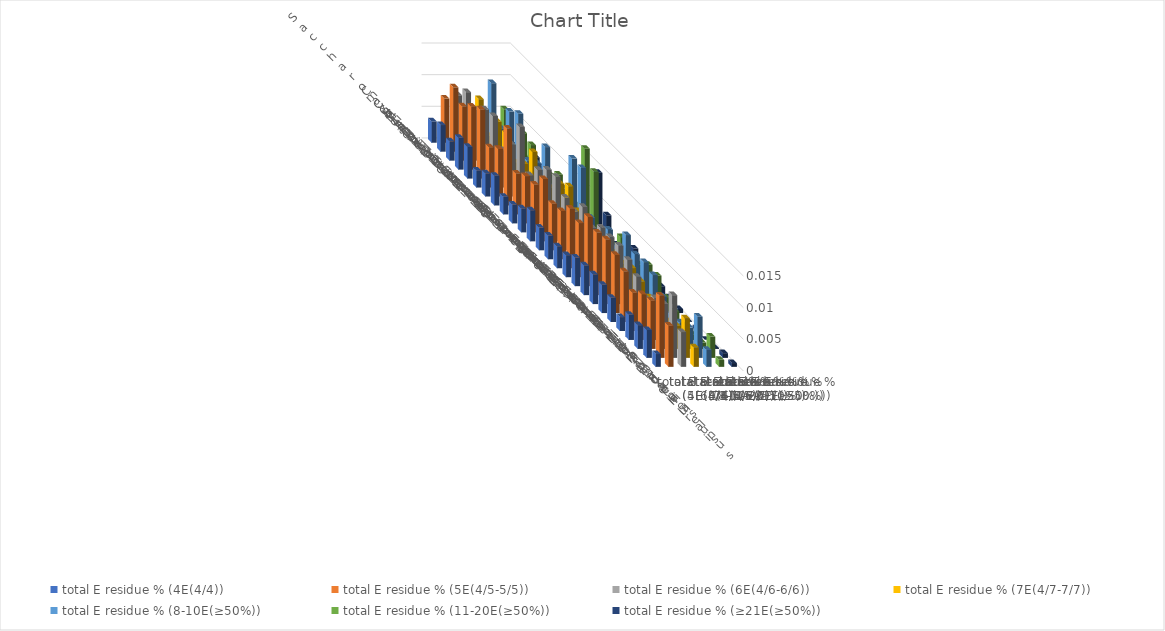
| Category | total E residue % (4E(4/4)) | total E residue % (5E(4/5-5/5)) | total E residue % (6E(4/6-6/6)) | total E residue % (7E(4/7-7/7)) | total E residue % (8-10E(≥50%)) | total E residue % (11-20E(≥50%)) | total E residue % (≥21E(≥50%)) |
|---|---|---|---|---|---|---|---|
| Saccharomyces cerevisiae S288c | 0.003 | 0.007 | 0.008 | 0.005 | 0.005 | 0.003 | 0 |
| Candida albicans | 0.004 | 0.01 | 0.009 | 0.008 | 0.011 | 0.007 | 0.001 |
| Candida auris | 0.003 | 0.009 | 0.008 | 0.004 | 0.005 | 0.002 | 0 |
| Candida tropicalis | 0.005 | 0.01 | 0.01 | 0.008 | 0.009 | 0.006 | 0.002 |
| Neurospora crassa | 0.005 | 0.011 | 0.01 | 0.007 | 0.01 | 0.005 | 0.002 |
| Magnaporthe oryzae | 0.003 | 0.006 | 0.006 | 0.004 | 0.004 | 0.002 | 0 |
| Trichoderma reesei | 0.004 | 0.008 | 0.008 | 0.005 | 0.005 | 0.004 | 0.001 |
| Cryptococcus neoformans | 0.005 | 0.012 | 0.012 | 0.008 | 0.009 | 0.005 | 0.001 |
| Ustilago maydis | 0.003 | 0.006 | 0.006 | 0.005 | 0.004 | 0.003 | 0.001 |
| Taiwanofungus camphoratus | 0.003 | 0.007 | 0.008 | 0.006 | 0.006 | 0.003 | 0.001 |
| Dictyostelium discoideum | 0.004 | 0.008 | 0.01 | 0.008 | 0.012 | 0.013 | 0.009 |
| Chlamydomonas reinhardtii | 0.005 | 0.01 | 0.01 | 0.009 | 0.012 | 0.011 | 0.004 |
| Drosophila melanogaster | 0.004 | 0.007 | 0.008 | 0.006 | 0.005 | 0.003 | 0.001 |
| Aedes aegypti | 0.004 | 0.008 | 0.008 | 0.004 | 0.004 | 0.002 | 0.001 |
| Plasmodium falciparum | 0.003 | 0.009 | 0.01 | 0.005 | 0.006 | 0.005 | 0.003 |
| Caenorhabditis elegans | 0.003 | 0.009 | 0.008 | 0.004 | 0.005 | 0.002 | 0 |
| Danio rerio | 0.005 | 0.011 | 0.009 | 0.005 | 0.008 | 0.003 | 0.001 |
| Mus musculus | 0.005 | 0.01 | 0.009 | 0.005 | 0.006 | 0.005 | 0.001 |
| Homo sapiens | 0.005 | 0.01 | 0.009 | 0.006 | 0.007 | 0.005 | 0.001 |
| Arabidopsis thaliana | 0.004 | 0.009 | 0.008 | 0.005 | 0.006 | 0.002 | 0.001 |
| Tetrahymena thermophila | 0.004 | 0.008 | 0.007 | 0.004 | 0.004 | 0.002 | 0 |
| Paramecium tetraurelia | 0.002 | 0.006 | 0.005 | 0.003 | 0.003 | 0.001 | 0 |
| Oxytricha trifallax | 0.004 | 0.007 | 0.007 | 0.003 | 0.003 | 0.001 | 0 |
| Stylonychia lemnae | 0.004 | 0.008 | 0.007 | 0.004 | 0.003 | 0.001 | 0 |
| Pseudocohnilembus persalinus | 0.004 | 0.01 | 0.01 | 0.006 | 0.007 | 0.003 | 0.001 |
| Stentor coeruleus | 0.002 | 0.007 | 0.006 | 0.003 | 0.003 | 0.001 | 0.001 |